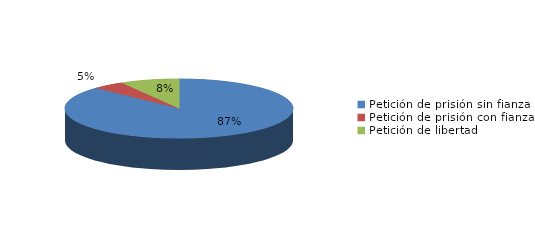
| Category | Series 0 |
|---|---|
| Petición de prisión sin fianza | 115 |
| Petición de prisión con fianza | 6 |
| Petición de libertad | 11 |